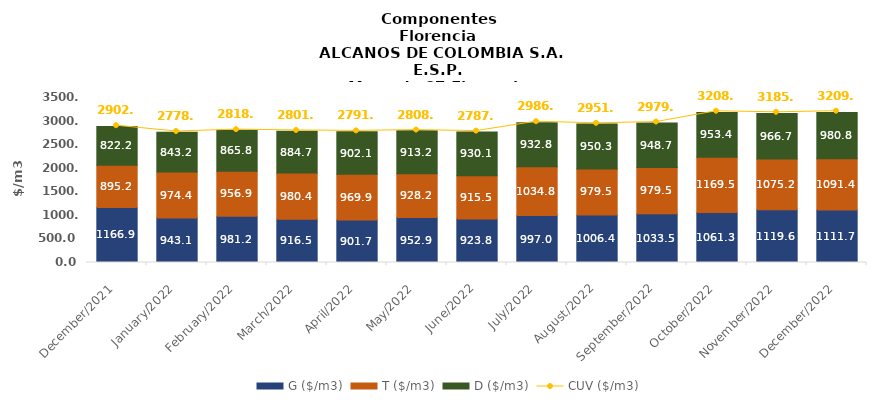
| Category | G ($/m3) | T ($/m3) | D ($/m3) |
|---|---|---|---|
| 2021-12-01 | 1166.9 | 895.22 | 822.17 |
| 2022-01-01 | 943.11 | 974.42 | 843.23 |
| 2022-02-01 | 981.24 | 956.88 | 865.81 |
| 2022-03-01 | 916.5 | 980.4 | 884.73 |
| 2022-04-01 | 901.73 | 969.87 | 902.09 |
| 2022-05-01 | 952.91 | 928.23 | 913.22 |
| 2022-06-01 | 923.8 | 915.47 | 930.11 |
| 2022-07-01 | 996.95 | 1034.77 | 932.75 |
| 2022-08-01 | 1006.44 | 979.53 | 950.32 |
| 2022-09-01 | 1033.47 | 979.51 | 948.67 |
| 2022-10-01 | 1061.27 | 1169.53 | 953.42 |
| 2022-11-01 | 1119.61 | 1075.19 | 966.69 |
| 2022-12-01 | 1111.69 | 1091.36 | 980.8 |